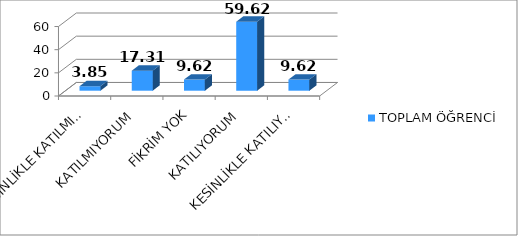
| Category | TOPLAM ÖĞRENCİ |
|---|---|
| KESİNLİKLE KATILMIYORUM | 3.85 |
| KATILMIYORUM | 17.31 |
| FİKRİM YOK | 9.62 |
| KATILIYORUM | 59.62 |
| KESİNLİKLE KATILIYORUM | 9.62 |